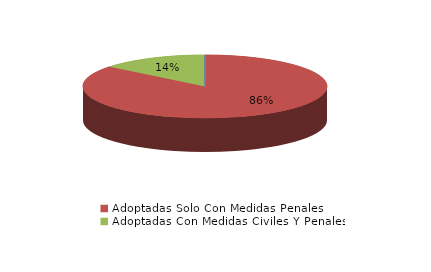
| Category | Series 0 |
|---|---|
| Denegadas | 0 |
| Adoptadas Solo Con Medidas Penales | 6 |
| Adoptadas Con Medidas Civiles Y Penales | 1 |
| Adoptadas Con Medidas Solo Civiles | 0 |